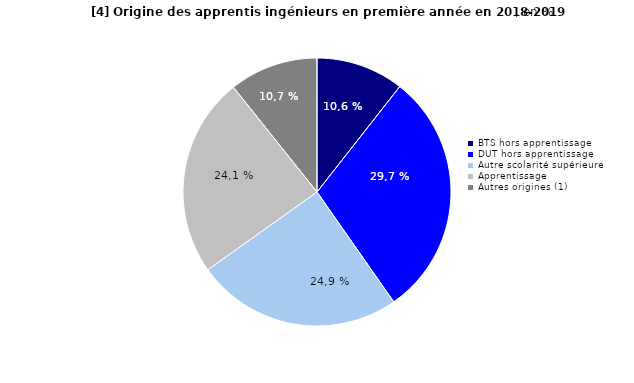
| Category | Series 0 |
|---|---|
| BTS hors apprentissage | 10.59 |
| DUT hors apprentissage | 29.71 |
| Autre scolarité supérieure | 24.85 |
| Apprentissage  | 24.14 |
| Autres origines (1) | 10.72 |